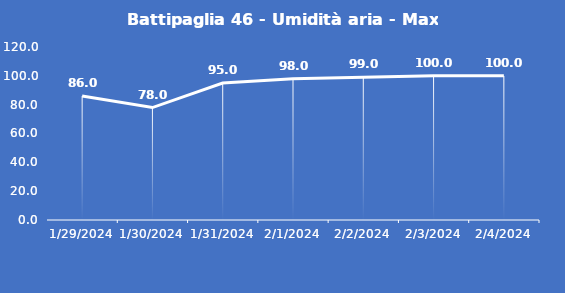
| Category | Battipaglia 46 - Umidità aria - Max (%) |
|---|---|
| 1/29/24 | 86 |
| 1/30/24 | 78 |
| 1/31/24 | 95 |
| 2/1/24 | 98 |
| 2/2/24 | 99 |
| 2/3/24 | 100 |
| 2/4/24 | 100 |